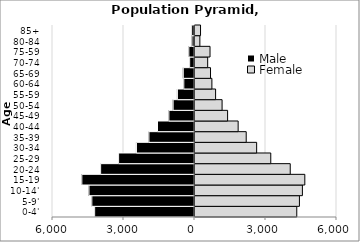
| Category | Male | Female |
|---|---|---|
| 0-4' | -4219.19 | 4300.02 |
| 5-9' | -4337.84 | 4412.28 |
| 10-14' | -4458.54 | 4537.85 |
| 15-19 | -4760.66 | 4640.59 |
| 20-24 | -3966.42 | 4024.53 |
| 25-29 | -3207.1 | 3201.75 |
| 30-34 | -2452.75 | 2604.88 |
| 35-39 | -1925.3 | 2163.9 |
| 40-44 | -1563.33 | 1823.4 |
| 45-49 | -1082.54 | 1377.39 |
| 50-54 | -902.55 | 1144.63 |
| 55-59 | -722 | 870.35 |
| 60-64 | -451.77 | 714.3 |
| 65-69 | -474.64 | 656.22 |
| 70-74 | -204.19 | 535.83 |
| 75-59 | -239.88 | 635.08 |
| 80-84 | -107.85 | 205.89 |
| 85+ | -120.51 | 234.32 |